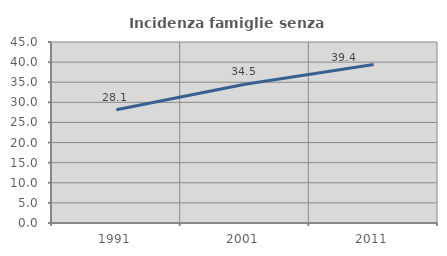
| Category | Incidenza famiglie senza nuclei |
|---|---|
| 1991.0 | 28.135 |
| 2001.0 | 34.502 |
| 2011.0 | 39.407 |